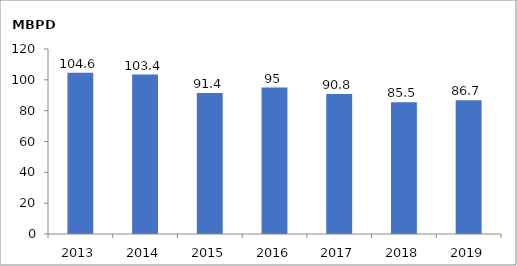
| Category | Series 0 |
|---|---|
| 2013.0 | 104.6 |
| 2014.0 | 103.4 |
| 2015.0 | 91.4 |
| 2016.0 | 95 |
| 2017.0 | 90.8 |
| 2018.0 | 85.5 |
| 2019.0 | 86.737 |